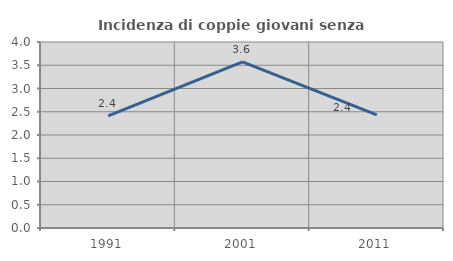
| Category | Incidenza di coppie giovani senza figli |
|---|---|
| 1991.0 | 2.41 |
| 2001.0 | 3.571 |
| 2011.0 | 2.431 |